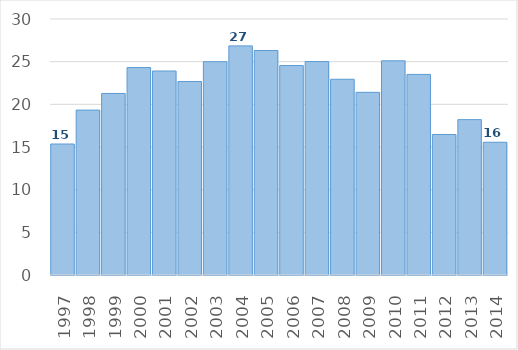
| Category | Series 1 |
|---|---|
| 1997.0 | 15.351 |
| 1998.0 | 19.322 |
| 1999.0 | 21.276 |
| 2000.0 | 24.313 |
| 2001.0 | 23.905 |
| 2002.0 | 22.677 |
| 2003.0 | 24.996 |
| 2004.0 | 26.85 |
| 2005.0 | 26.308 |
| 2006.0 | 24.543 |
| 2007.0 | 25.012 |
| 2008.0 | 22.936 |
| 2009.0 | 21.407 |
| 2010.0 | 25.099 |
| 2011.0 | 23.507 |
| 2012.0 | 16.464 |
| 2013.0 | 18.208 |
| 2014.0 | 15.555 |